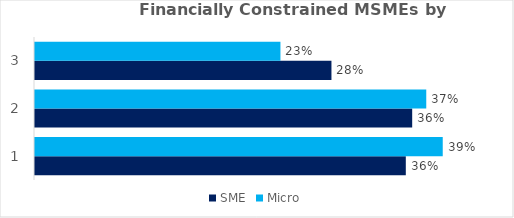
| Category | SME | Micro |
|---|---|---|
| 0 | 0.355 | 0.39 |
| 1 | 0.361 | 0.375 |
| 2 | 0.284 | 0.235 |